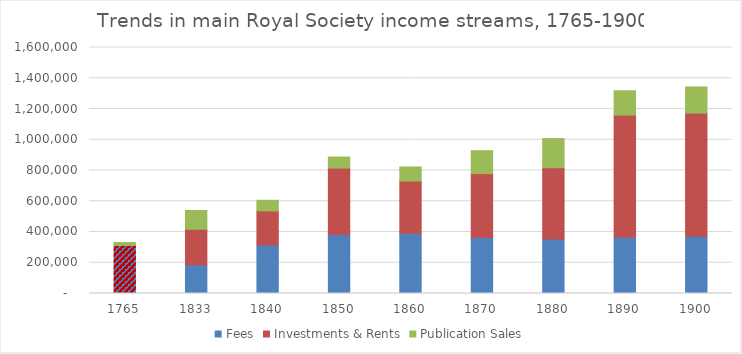
| Category | Fees | Investments & Rents | Publication Sales |
|---|---|---|---|
| 1765.0 | 312401 | 0 | 18960 |
| 1833.0 | 185610 | 232238 | 122130 |
| 1840.0 | 316128 | 221029 | 69108 |
| 1850.0 | 383088 | 432631 | 71631 |
| 1860.0 | 392208 | 339305 | 91296 |
| 1870.0 | 363888 | 415600 | 149508 |
| 1880.0 | 354000 | 464251 | 189498 |
| 1890.0 | 366240 | 794435 | 158202 |
| 1900.0 | 372000 | 801548 | 169992 |